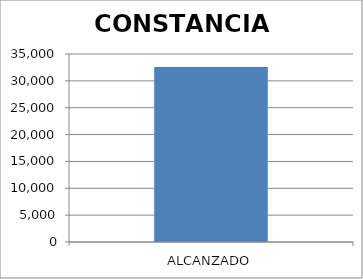
| Category | CONSTANCIAS  |
|---|---|
| ALCANZADO | 32593 |